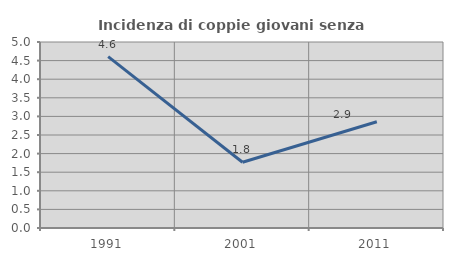
| Category | Incidenza di coppie giovani senza figli |
|---|---|
| 1991.0 | 4.605 |
| 2001.0 | 1.767 |
| 2011.0 | 2.857 |